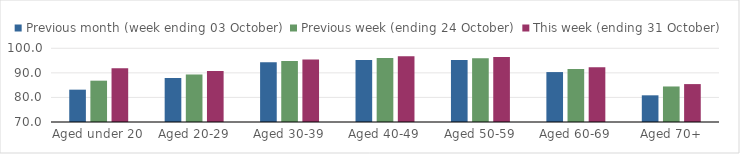
| Category | Previous month (week ending 03 October) | Previous week (ending 24 October) | This week (ending 31 October) |
|---|---|---|---|
| Aged under 20 | 83.16 | 86.82 | 91.92 |
| Aged 20-29 | 87.9 | 89.34 | 90.8 |
| Aged 30-39 | 94.35 | 94.85 | 95.42 |
| Aged 40-49 | 95.26 | 96.08 | 96.73 |
| Aged 50-59 | 95.27 | 95.94 | 96.42 |
| Aged 60-69 | 90.32 | 91.57 | 92.28 |
| Aged 70+ | 80.86 | 84.46 | 85.43 |